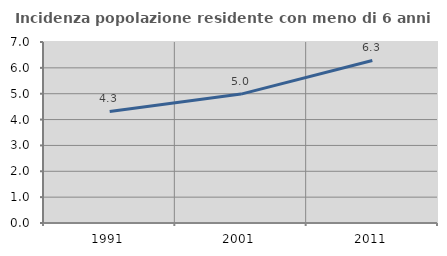
| Category | Incidenza popolazione residente con meno di 6 anni |
|---|---|
| 1991.0 | 4.316 |
| 2001.0 | 4.985 |
| 2011.0 | 6.285 |